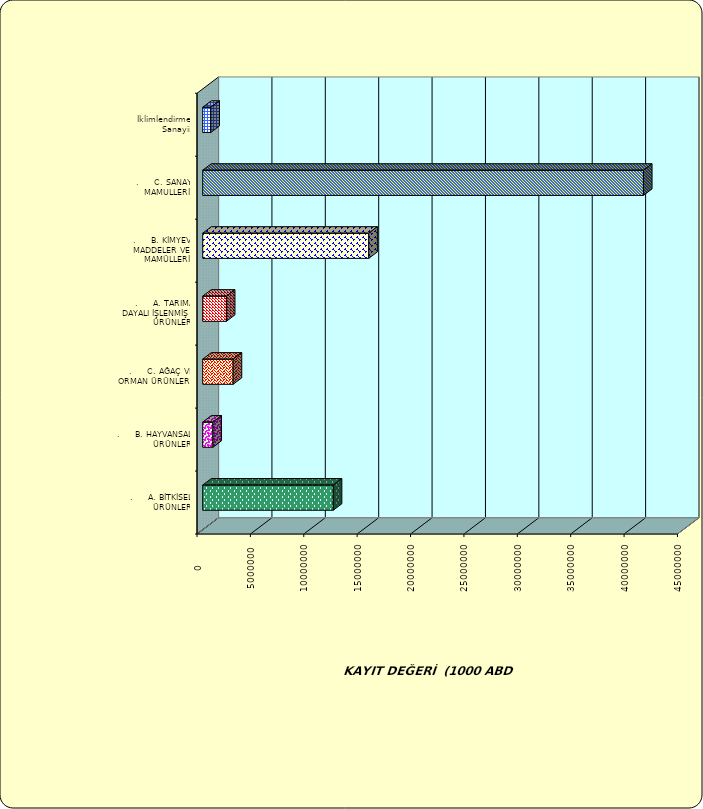
| Category | Series 0 |
|---|---|
| .     A. BİTKİSEL ÜRÜNLER | 12227122.512 |
| .     B. HAYVANSAL ÜRÜNLER | 957145.974 |
| .     C. AĞAÇ VE ORMAN ÜRÜNLERİ | 2852494.392 |
| .     A. TARIMA DAYALI İŞLENMİŞ ÜRÜNLER | 2217463.648 |
| .     B. KİMYEVİ MADDELER VE MAMÜLLERİ | 15555583.586 |
| .     C. SANAYİ MAMULLERİ | 41280061.108 |
|  İklimlendirme Sanayii | 764022.057 |